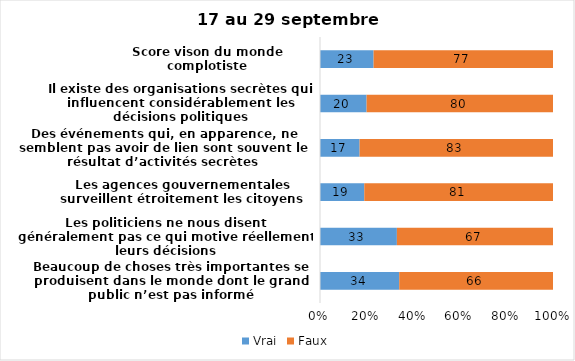
| Category | Vrai | Faux |
|---|---|---|
| Beaucoup de choses très importantes se produisent dans le monde dont le grand public n’est pas informé | 34 | 66 |
| Les politiciens ne nous disent généralement pas ce qui motive réellement leurs décisions | 33 | 67 |
| Les agences gouvernementales surveillent étroitement les citoyens | 19 | 81 |
| Des événements qui, en apparence, ne semblent pas avoir de lien sont souvent le résultat d’activités secrètes | 17 | 83 |
| Il existe des organisations secrètes qui influencent considérablement les décisions politiques | 20 | 80 |
| Score vison du monde complotiste | 23 | 77 |